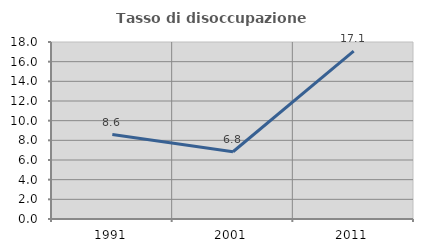
| Category | Tasso di disoccupazione giovanile  |
|---|---|
| 1991.0 | 8.589 |
| 2001.0 | 6.838 |
| 2011.0 | 17.073 |